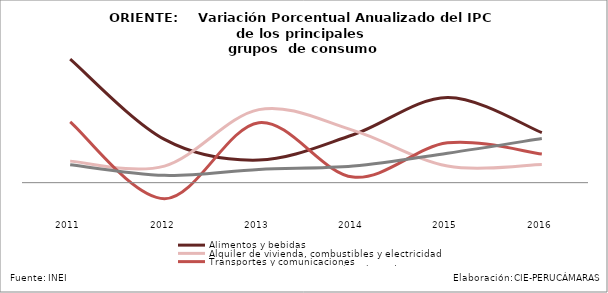
| Category | Alimentos y bebidas | Alquiler de vivienda, combustibles y electricidad | Transportes y comunicaciones | Esparcimiento,  servicios culturales y de enseñanza |
|---|---|---|---|---|
| 2011.0 | 0.087 | 0.015 | 0.043 | 0.013 |
| 2012.0 | 0.031 | 0.012 | -0.011 | 0.005 |
| 2013.0 | 0.016 | 0.052 | 0.042 | 0.009 |
| 2014.0 | 0.034 | 0.037 | 0.004 | 0.012 |
| 2015.0 | 0.06 | 0.012 | 0.028 | 0.021 |
| 2016.0 | 0.035 | 0.013 | 0.02 | 0.031 |